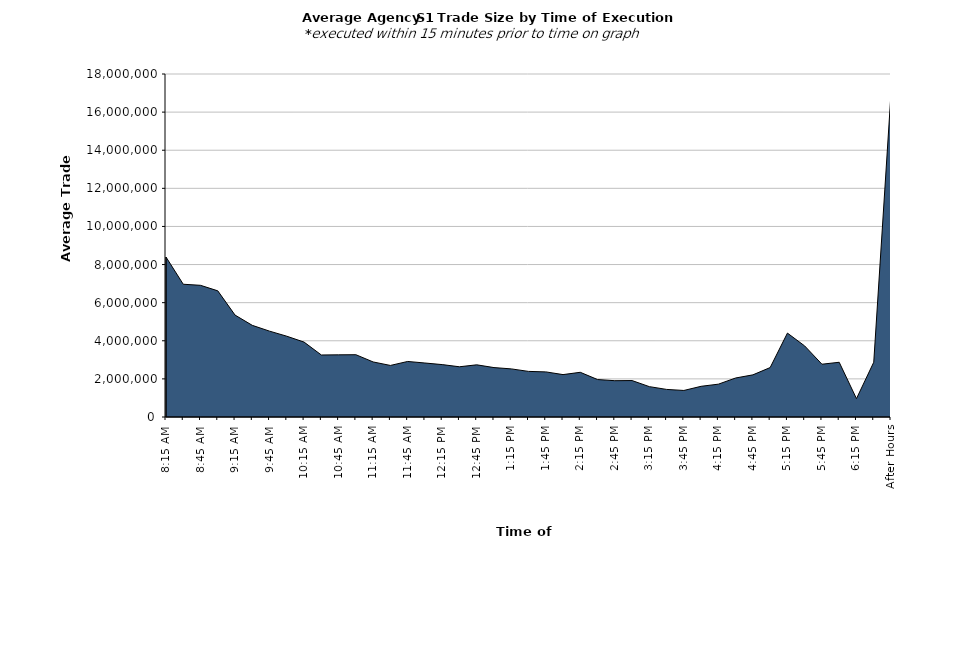
| Category | Series 0 |
|---|---|
| 8:15 AM | 8395226.235 |
| 8:30 AM | 6966557.746 |
| 8:45 AM | 6910056.988 |
| 9:00 AM | 6620975.844 |
| 9:15 AM | 5348115.189 |
| 9:30 AM | 4809932.716 |
| 9:45 AM | 4505178.605 |
| 10:00 AM | 4238577.4 |
| 10:15 AM | 3929784.649 |
| 10:30 AM | 3254125.896 |
| 10:45 AM | 3262601.091 |
| 11:00 AM | 3269139.161 |
| 11:15 AM | 2889288.639 |
| 11:30 AM | 2705524.148 |
| 11:45 AM | 2914648.576 |
| 12:00 PM | 2833519.813 |
| 12:15 PM | 2749878.814 |
| 12:30 PM | 2635901.622 |
| 12:45 PM | 2738104.332 |
| 1:00 PM | 2593290.578 |
| 1:15 PM | 2525069.32 |
| 1:30 PM | 2393230.121 |
| 1:45 PM | 2367928.347 |
| 2:00 PM | 2224730.736 |
| 2:15 PM | 2345423.635 |
| 2:30 PM | 1965920.334 |
| 2:45 PM | 1905592.828 |
| 3:00 PM | 1912554.826 |
| 3:15 PM | 1593747.592 |
| 3:30 PM | 1447782.096 |
| 3:45 PM | 1392654.605 |
| 4:00 PM | 1610605.441 |
| 4:15 PM | 1723214.568 |
| 4:30 PM | 2047365.094 |
| 4:45 PM | 2212113.364 |
| 5:00 PM | 2594770.946 |
| 5:15 PM | 4402525.655 |
| 5:30 PM | 3728728.237 |
| 5:45 PM | 2770170.557 |
| 6:00 PM | 2871862.348 |
| 6:15 PM | 964196.85 |
| 6:30 PM | 2873208.333 |
| After Hours | 17001864.957 |